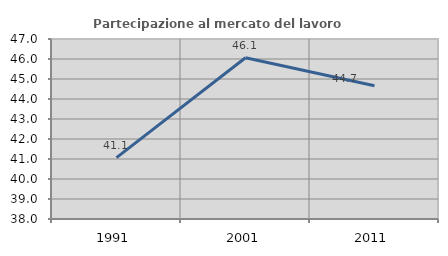
| Category | Partecipazione al mercato del lavoro  femminile |
|---|---|
| 1991.0 | 41.071 |
| 2001.0 | 46.061 |
| 2011.0 | 44.667 |